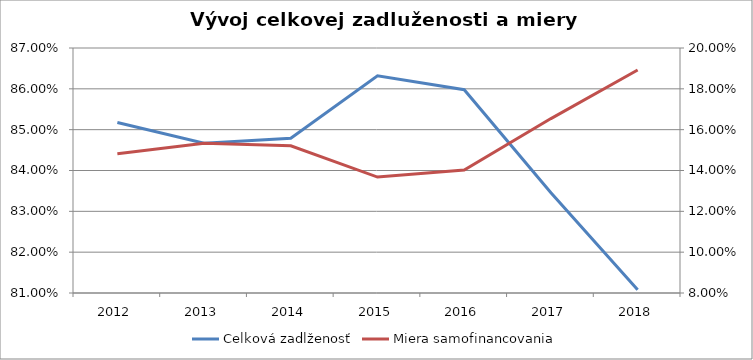
| Category | Celková zadlženosť |
|---|---|
| 2012.0 | 0.852 |
| 2013.0 | 0.847 |
| 2014.0 | 0.848 |
| 2015.0 | 0.863 |
| 2016.0 | 0.86 |
| 2017.0 | 0.835 |
| 2018.0 | 0.811 |